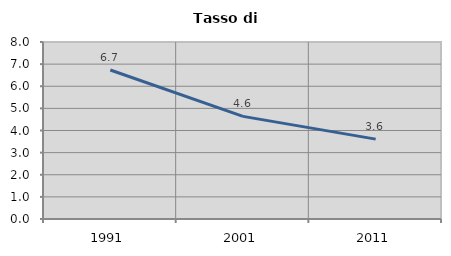
| Category | Tasso di disoccupazione   |
|---|---|
| 1991.0 | 6.735 |
| 2001.0 | 4.638 |
| 2011.0 | 3.61 |